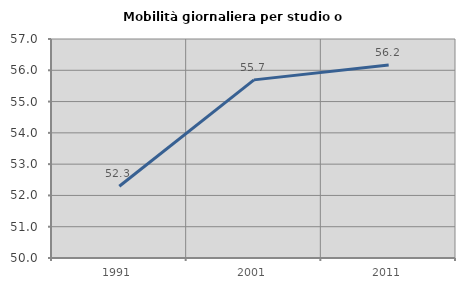
| Category | Mobilità giornaliera per studio o lavoro |
|---|---|
| 1991.0 | 52.295 |
| 2001.0 | 55.693 |
| 2011.0 | 56.167 |